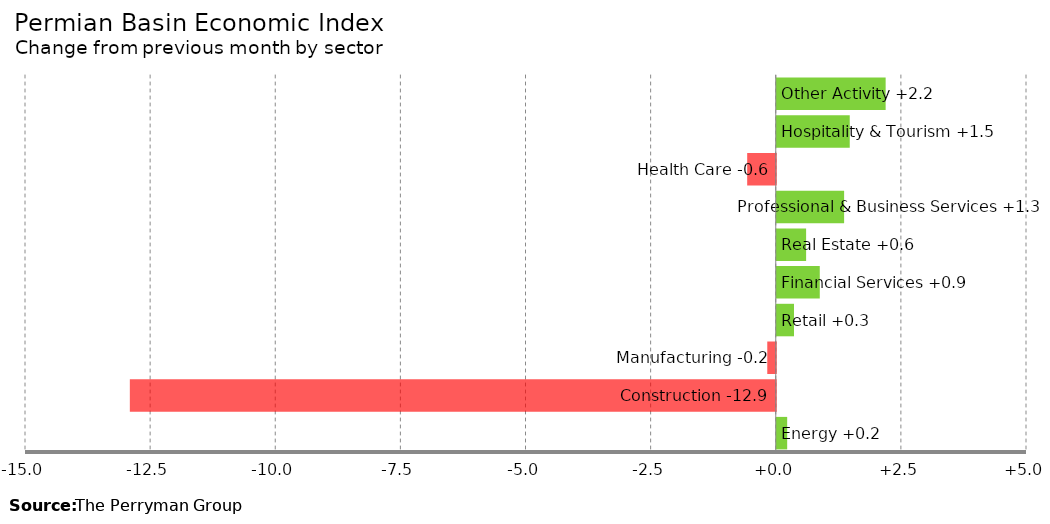
| Category | Change |
|---|---|
| Energy | 0.208 |
| Construction | -12.905 |
| Manufacturing | -0.17 |
| Retail | 0.345 |
| Financial Services | 0.86 |
| Real Estate | 0.587 |
| Professional & Business Services | 1.346 |
| Health Care | -0.571 |
| Hospitality & Tourism | 1.458 |
| Other Activity | 2.176 |